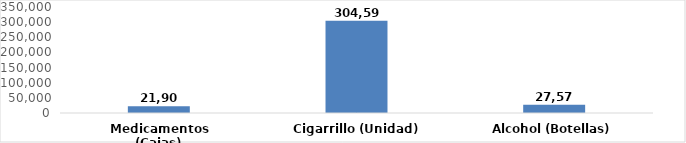
| Category | Series 0 |
|---|---|
| Medicamentos (Cajas) | 21901 |
| Cigarrillo (Unidad) | 304591 |
| Alcohol (Botellas) | 27574 |